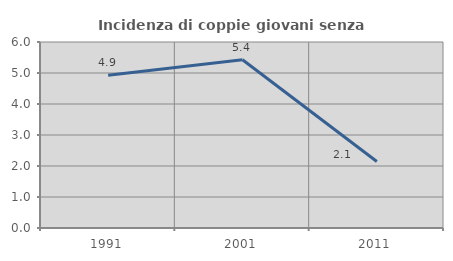
| Category | Incidenza di coppie giovani senza figli |
|---|---|
| 1991.0 | 4.924 |
| 2001.0 | 5.428 |
| 2011.0 | 2.144 |